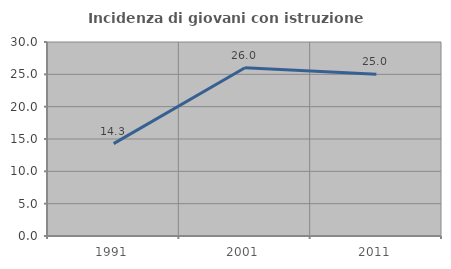
| Category | Incidenza di giovani con istruzione universitaria |
|---|---|
| 1991.0 | 14.286 |
| 2001.0 | 26.027 |
| 2011.0 | 25 |